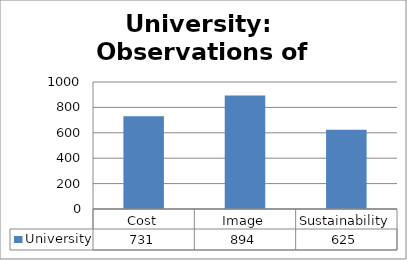
| Category | University |
|---|---|
| Cost | 731 |
| Image | 894 |
| Sustainability | 625 |